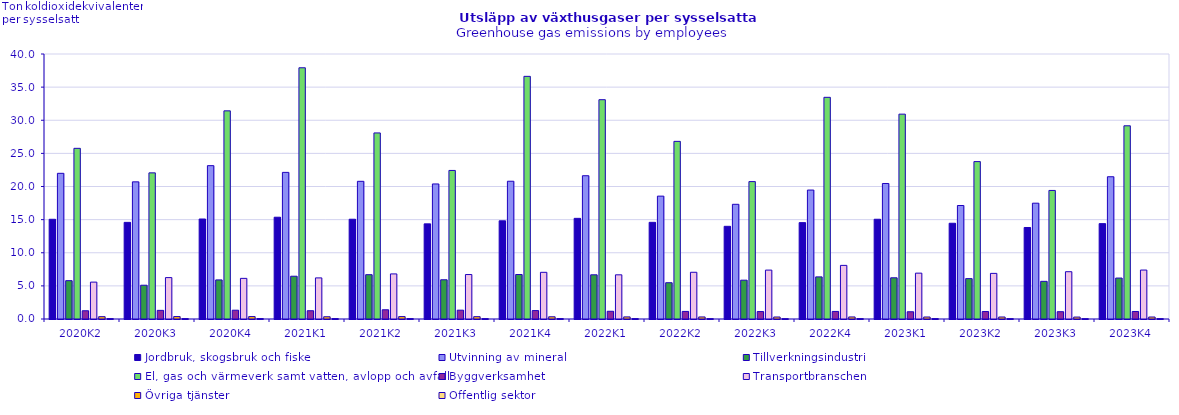
| Category | Jordbruk, skogsbruk och fiske | Utvinning av mineral | Tillverkningsindustri | El, gas och värmeverk samt vatten, avlopp och avfall | Byggverksamhet | Transportbranschen | Övriga tjänster | Offentlig sektor |
|---|---|---|---|---|---|---|---|---|
| 2020K2 | 15.051 | 21.989 | 5.786 | 25.76 | 1.244 | 5.567 | 0.353 | 0.063 |
| 2020K3 | 14.585 | 20.7 | 5.097 | 22.058 | 1.302 | 6.249 | 0.37 | 0.065 |
| 2020K4 | 15.093 | 23.148 | 5.9 | 31.419 | 1.326 | 6.133 | 0.368 | 0.069 |
| 2021K1 | 15.362 | 22.13 | 6.457 | 37.921 | 1.249 | 6.203 | 0.34 | 0.068 |
| 2021K2 | 15.057 | 20.782 | 6.69 | 28.086 | 1.393 | 6.804 | 0.365 | 0.064 |
| 2021K3 | 14.363 | 20.385 | 5.92 | 22.423 | 1.332 | 6.712 | 0.352 | 0.063 |
| 2021K4 | 14.821 | 20.794 | 6.716 | 36.626 | 1.272 | 7.046 | 0.336 | 0.067 |
| 2022K1 | 15.191 | 21.625 | 6.672 | 33.103 | 1.167 | 6.669 | 0.318 | 0.066 |
| 2022K2 | 14.591 | 18.547 | 5.477 | 26.813 | 1.143 | 7.054 | 0.311 | 0.057 |
| 2022K3 | 13.99 | 17.313 | 5.86 | 20.738 | 1.124 | 7.381 | 0.304 | 0.056 |
| 2022K4 | 14.546 | 19.464 | 6.356 | 33.461 | 1.139 | 8.094 | 0.31 | 0.062 |
| 2023K1 | 15.055 | 20.453 | 6.221 | 30.921 | 1.094 | 6.921 | 0.302 | 0.064 |
| 2023K2 | 14.453 | 17.132 | 6.097 | 23.758 | 1.125 | 6.885 | 0.304 | 0.057 |
| 2023K3 | 13.812 | 17.48 | 5.685 | 19.404 | 1.102 | 7.138 | 0.294 | 0.055 |
| 2023K4 | 14.396 | 21.474 | 6.18 | 29.164 | 1.134 | 7.389 | 0.3 | 0.061 |